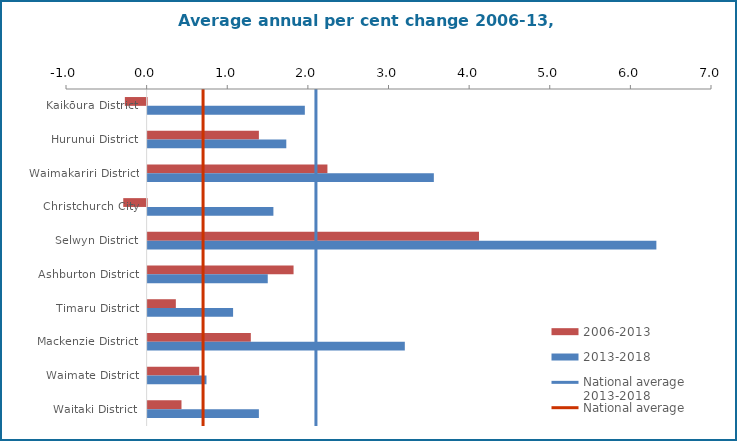
| Category | 2006-2013 | 2013-2018 |
|---|---|---|
| Kaikōura District | -0.27 | 1.95 |
| Hurunui District | 1.38 | 1.72 |
| Waimakariri District | 2.23 | 3.55 |
| Christchurch City | -0.29 | 1.56 |
| Selwyn District | 4.11 | 6.31 |
| Ashburton District | 1.81 | 1.49 |
| Timaru District | 0.35 | 1.06 |
| Mackenzie District | 1.28 | 3.19 |
| Waimate District | 0.64 | 0.73 |
| Waitaki District | 0.42 | 1.38 |